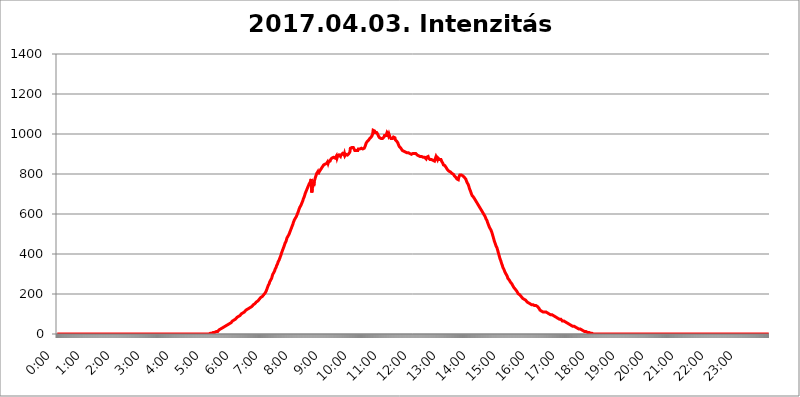
| Category | 2017.04.03. Intenzitás [W/m^2] |
|---|---|
| 0.0 | 0 |
| 0.0006944444444444445 | 0 |
| 0.001388888888888889 | 0 |
| 0.0020833333333333333 | 0 |
| 0.002777777777777778 | 0 |
| 0.003472222222222222 | 0 |
| 0.004166666666666667 | 0 |
| 0.004861111111111111 | 0 |
| 0.005555555555555556 | 0 |
| 0.0062499999999999995 | 0 |
| 0.006944444444444444 | 0 |
| 0.007638888888888889 | 0 |
| 0.008333333333333333 | 0 |
| 0.009027777777777779 | 0 |
| 0.009722222222222222 | 0 |
| 0.010416666666666666 | 0 |
| 0.011111111111111112 | 0 |
| 0.011805555555555555 | 0 |
| 0.012499999999999999 | 0 |
| 0.013194444444444444 | 0 |
| 0.013888888888888888 | 0 |
| 0.014583333333333332 | 0 |
| 0.015277777777777777 | 0 |
| 0.015972222222222224 | 0 |
| 0.016666666666666666 | 0 |
| 0.017361111111111112 | 0 |
| 0.018055555555555557 | 0 |
| 0.01875 | 0 |
| 0.019444444444444445 | 0 |
| 0.02013888888888889 | 0 |
| 0.020833333333333332 | 0 |
| 0.02152777777777778 | 0 |
| 0.022222222222222223 | 0 |
| 0.02291666666666667 | 0 |
| 0.02361111111111111 | 0 |
| 0.024305555555555556 | 0 |
| 0.024999999999999998 | 0 |
| 0.025694444444444447 | 0 |
| 0.02638888888888889 | 0 |
| 0.027083333333333334 | 0 |
| 0.027777777777777776 | 0 |
| 0.02847222222222222 | 0 |
| 0.029166666666666664 | 0 |
| 0.029861111111111113 | 0 |
| 0.030555555555555555 | 0 |
| 0.03125 | 0 |
| 0.03194444444444445 | 0 |
| 0.03263888888888889 | 0 |
| 0.03333333333333333 | 0 |
| 0.034027777777777775 | 0 |
| 0.034722222222222224 | 0 |
| 0.035416666666666666 | 0 |
| 0.036111111111111115 | 0 |
| 0.03680555555555556 | 0 |
| 0.0375 | 0 |
| 0.03819444444444444 | 0 |
| 0.03888888888888889 | 0 |
| 0.03958333333333333 | 0 |
| 0.04027777777777778 | 0 |
| 0.04097222222222222 | 0 |
| 0.041666666666666664 | 0 |
| 0.042361111111111106 | 0 |
| 0.04305555555555556 | 0 |
| 0.043750000000000004 | 0 |
| 0.044444444444444446 | 0 |
| 0.04513888888888889 | 0 |
| 0.04583333333333334 | 0 |
| 0.04652777777777778 | 0 |
| 0.04722222222222222 | 0 |
| 0.04791666666666666 | 0 |
| 0.04861111111111111 | 0 |
| 0.049305555555555554 | 0 |
| 0.049999999999999996 | 0 |
| 0.05069444444444445 | 0 |
| 0.051388888888888894 | 0 |
| 0.052083333333333336 | 0 |
| 0.05277777777777778 | 0 |
| 0.05347222222222222 | 0 |
| 0.05416666666666667 | 0 |
| 0.05486111111111111 | 0 |
| 0.05555555555555555 | 0 |
| 0.05625 | 0 |
| 0.05694444444444444 | 0 |
| 0.057638888888888885 | 0 |
| 0.05833333333333333 | 0 |
| 0.05902777777777778 | 0 |
| 0.059722222222222225 | 0 |
| 0.06041666666666667 | 0 |
| 0.061111111111111116 | 0 |
| 0.06180555555555556 | 0 |
| 0.0625 | 0 |
| 0.06319444444444444 | 0 |
| 0.06388888888888888 | 0 |
| 0.06458333333333334 | 0 |
| 0.06527777777777778 | 0 |
| 0.06597222222222222 | 0 |
| 0.06666666666666667 | 0 |
| 0.06736111111111111 | 0 |
| 0.06805555555555555 | 0 |
| 0.06874999999999999 | 0 |
| 0.06944444444444443 | 0 |
| 0.07013888888888889 | 0 |
| 0.07083333333333333 | 0 |
| 0.07152777777777779 | 0 |
| 0.07222222222222223 | 0 |
| 0.07291666666666667 | 0 |
| 0.07361111111111111 | 0 |
| 0.07430555555555556 | 0 |
| 0.075 | 0 |
| 0.07569444444444444 | 0 |
| 0.0763888888888889 | 0 |
| 0.07708333333333334 | 0 |
| 0.07777777777777778 | 0 |
| 0.07847222222222222 | 0 |
| 0.07916666666666666 | 0 |
| 0.0798611111111111 | 0 |
| 0.08055555555555556 | 0 |
| 0.08125 | 0 |
| 0.08194444444444444 | 0 |
| 0.08263888888888889 | 0 |
| 0.08333333333333333 | 0 |
| 0.08402777777777777 | 0 |
| 0.08472222222222221 | 0 |
| 0.08541666666666665 | 0 |
| 0.08611111111111112 | 0 |
| 0.08680555555555557 | 0 |
| 0.08750000000000001 | 0 |
| 0.08819444444444445 | 0 |
| 0.08888888888888889 | 0 |
| 0.08958333333333333 | 0 |
| 0.09027777777777778 | 0 |
| 0.09097222222222222 | 0 |
| 0.09166666666666667 | 0 |
| 0.09236111111111112 | 0 |
| 0.09305555555555556 | 0 |
| 0.09375 | 0 |
| 0.09444444444444444 | 0 |
| 0.09513888888888888 | 0 |
| 0.09583333333333333 | 0 |
| 0.09652777777777777 | 0 |
| 0.09722222222222222 | 0 |
| 0.09791666666666667 | 0 |
| 0.09861111111111111 | 0 |
| 0.09930555555555555 | 0 |
| 0.09999999999999999 | 0 |
| 0.10069444444444443 | 0 |
| 0.1013888888888889 | 0 |
| 0.10208333333333335 | 0 |
| 0.10277777777777779 | 0 |
| 0.10347222222222223 | 0 |
| 0.10416666666666667 | 0 |
| 0.10486111111111111 | 0 |
| 0.10555555555555556 | 0 |
| 0.10625 | 0 |
| 0.10694444444444444 | 0 |
| 0.1076388888888889 | 0 |
| 0.10833333333333334 | 0 |
| 0.10902777777777778 | 0 |
| 0.10972222222222222 | 0 |
| 0.1111111111111111 | 0 |
| 0.11180555555555556 | 0 |
| 0.11180555555555556 | 0 |
| 0.1125 | 0 |
| 0.11319444444444444 | 0 |
| 0.11388888888888889 | 0 |
| 0.11458333333333333 | 0 |
| 0.11527777777777777 | 0 |
| 0.11597222222222221 | 0 |
| 0.11666666666666665 | 0 |
| 0.1173611111111111 | 0 |
| 0.11805555555555557 | 0 |
| 0.11944444444444445 | 0 |
| 0.12013888888888889 | 0 |
| 0.12083333333333333 | 0 |
| 0.12152777777777778 | 0 |
| 0.12222222222222223 | 0 |
| 0.12291666666666667 | 0 |
| 0.12291666666666667 | 0 |
| 0.12361111111111112 | 0 |
| 0.12430555555555556 | 0 |
| 0.125 | 0 |
| 0.12569444444444444 | 0 |
| 0.12638888888888888 | 0 |
| 0.12708333333333333 | 0 |
| 0.16875 | 0 |
| 0.12847222222222224 | 0 |
| 0.12916666666666668 | 0 |
| 0.12986111111111112 | 0 |
| 0.13055555555555556 | 0 |
| 0.13125 | 0 |
| 0.13194444444444445 | 0 |
| 0.1326388888888889 | 0 |
| 0.13333333333333333 | 0 |
| 0.13402777777777777 | 0 |
| 0.13402777777777777 | 0 |
| 0.13472222222222222 | 0 |
| 0.13541666666666666 | 0 |
| 0.1361111111111111 | 0 |
| 0.13749999999999998 | 0 |
| 0.13819444444444443 | 0 |
| 0.1388888888888889 | 0 |
| 0.13958333333333334 | 0 |
| 0.14027777777777778 | 0 |
| 0.14097222222222222 | 0 |
| 0.14166666666666666 | 0 |
| 0.1423611111111111 | 0 |
| 0.14305555555555557 | 0 |
| 0.14375000000000002 | 0 |
| 0.14444444444444446 | 0 |
| 0.1451388888888889 | 0 |
| 0.1451388888888889 | 0 |
| 0.14652777777777778 | 0 |
| 0.14722222222222223 | 0 |
| 0.14791666666666667 | 0 |
| 0.1486111111111111 | 0 |
| 0.14930555555555555 | 0 |
| 0.15 | 0 |
| 0.15069444444444444 | 0 |
| 0.15138888888888888 | 0 |
| 0.15208333333333332 | 0 |
| 0.15277777777777776 | 0 |
| 0.15347222222222223 | 0 |
| 0.15416666666666667 | 0 |
| 0.15486111111111112 | 0 |
| 0.15555555555555556 | 0 |
| 0.15625 | 0 |
| 0.15694444444444444 | 0 |
| 0.15763888888888888 | 0 |
| 0.15833333333333333 | 0 |
| 0.15902777777777777 | 0 |
| 0.15972222222222224 | 0 |
| 0.16041666666666668 | 0 |
| 0.16111111111111112 | 0 |
| 0.16180555555555556 | 0 |
| 0.1625 | 0 |
| 0.16319444444444445 | 0 |
| 0.1638888888888889 | 0 |
| 0.16458333333333333 | 0 |
| 0.16527777777777777 | 0 |
| 0.16597222222222222 | 0 |
| 0.16666666666666666 | 0 |
| 0.1673611111111111 | 0 |
| 0.16805555555555554 | 0 |
| 0.16874999999999998 | 0 |
| 0.16944444444444443 | 0 |
| 0.17013888888888887 | 0 |
| 0.1708333333333333 | 0 |
| 0.17152777777777775 | 0 |
| 0.17222222222222225 | 0 |
| 0.1729166666666667 | 0 |
| 0.17361111111111113 | 0 |
| 0.17430555555555557 | 0 |
| 0.17500000000000002 | 0 |
| 0.17569444444444446 | 0 |
| 0.1763888888888889 | 0 |
| 0.17708333333333334 | 0 |
| 0.17777777777777778 | 0 |
| 0.17847222222222223 | 0 |
| 0.17916666666666667 | 0 |
| 0.1798611111111111 | 0 |
| 0.18055555555555555 | 0 |
| 0.18125 | 0 |
| 0.18194444444444444 | 0 |
| 0.1826388888888889 | 0 |
| 0.18333333333333335 | 0 |
| 0.1840277777777778 | 0 |
| 0.18472222222222223 | 0 |
| 0.18541666666666667 | 0 |
| 0.18611111111111112 | 0 |
| 0.18680555555555556 | 0 |
| 0.1875 | 0 |
| 0.18819444444444444 | 0 |
| 0.18888888888888888 | 0 |
| 0.18958333333333333 | 0 |
| 0.19027777777777777 | 0 |
| 0.1909722222222222 | 0 |
| 0.19166666666666665 | 0 |
| 0.19236111111111112 | 0 |
| 0.19305555555555554 | 0 |
| 0.19375 | 0 |
| 0.19444444444444445 | 0 |
| 0.1951388888888889 | 0 |
| 0.19583333333333333 | 0 |
| 0.19652777777777777 | 0 |
| 0.19722222222222222 | 0 |
| 0.19791666666666666 | 0 |
| 0.1986111111111111 | 0 |
| 0.19930555555555554 | 0 |
| 0.19999999999999998 | 0 |
| 0.20069444444444443 | 0 |
| 0.20138888888888887 | 0 |
| 0.2020833333333333 | 0 |
| 0.2027777777777778 | 0 |
| 0.2034722222222222 | 0 |
| 0.2041666666666667 | 0 |
| 0.20486111111111113 | 0 |
| 0.20555555555555557 | 0 |
| 0.20625000000000002 | 0 |
| 0.20694444444444446 | 0 |
| 0.2076388888888889 | 0 |
| 0.20833333333333334 | 0 |
| 0.20902777777777778 | 0 |
| 0.20972222222222223 | 0 |
| 0.21041666666666667 | 0 |
| 0.2111111111111111 | 0 |
| 0.21180555555555555 | 0 |
| 0.2125 | 0 |
| 0.21319444444444444 | 3.525 |
| 0.2138888888888889 | 3.525 |
| 0.21458333333333335 | 3.525 |
| 0.2152777777777778 | 3.525 |
| 0.21597222222222223 | 3.525 |
| 0.21666666666666667 | 3.525 |
| 0.21736111111111112 | 3.525 |
| 0.21805555555555556 | 3.525 |
| 0.21875 | 7.887 |
| 0.21944444444444444 | 7.887 |
| 0.22013888888888888 | 7.887 |
| 0.22083333333333333 | 7.887 |
| 0.22152777777777777 | 7.887 |
| 0.2222222222222222 | 7.887 |
| 0.22291666666666665 | 12.257 |
| 0.2236111111111111 | 12.257 |
| 0.22430555555555556 | 12.257 |
| 0.225 | 12.257 |
| 0.22569444444444445 | 16.636 |
| 0.2263888888888889 | 16.636 |
| 0.22708333333333333 | 21.024 |
| 0.22777777777777777 | 21.024 |
| 0.22847222222222222 | 21.024 |
| 0.22916666666666666 | 25.419 |
| 0.2298611111111111 | 25.419 |
| 0.23055555555555554 | 25.419 |
| 0.23124999999999998 | 29.823 |
| 0.23194444444444443 | 29.823 |
| 0.23263888888888887 | 29.823 |
| 0.2333333333333333 | 34.234 |
| 0.2340277777777778 | 34.234 |
| 0.2347222222222222 | 38.653 |
| 0.2354166666666667 | 38.653 |
| 0.23611111111111113 | 38.653 |
| 0.23680555555555557 | 38.653 |
| 0.23750000000000002 | 43.079 |
| 0.23819444444444446 | 43.079 |
| 0.2388888888888889 | 47.511 |
| 0.23958333333333334 | 47.511 |
| 0.24027777777777778 | 47.511 |
| 0.24097222222222223 | 51.951 |
| 0.24166666666666667 | 51.951 |
| 0.2423611111111111 | 56.398 |
| 0.24305555555555555 | 56.398 |
| 0.24375 | 56.398 |
| 0.24444444444444446 | 60.85 |
| 0.24513888888888888 | 60.85 |
| 0.24583333333333335 | 65.31 |
| 0.2465277777777778 | 65.31 |
| 0.24722222222222223 | 65.31 |
| 0.24791666666666667 | 69.775 |
| 0.24861111111111112 | 74.246 |
| 0.24930555555555556 | 74.246 |
| 0.25 | 74.246 |
| 0.25069444444444444 | 78.722 |
| 0.2513888888888889 | 78.722 |
| 0.2520833333333333 | 83.205 |
| 0.25277777777777777 | 83.205 |
| 0.2534722222222222 | 83.205 |
| 0.25416666666666665 | 87.692 |
| 0.2548611111111111 | 87.692 |
| 0.2555555555555556 | 92.184 |
| 0.25625000000000003 | 92.184 |
| 0.2569444444444445 | 96.682 |
| 0.2576388888888889 | 96.682 |
| 0.25833333333333336 | 101.184 |
| 0.2590277777777778 | 101.184 |
| 0.25972222222222224 | 101.184 |
| 0.2604166666666667 | 105.69 |
| 0.2611111111111111 | 110.201 |
| 0.26180555555555557 | 110.201 |
| 0.2625 | 110.201 |
| 0.26319444444444445 | 114.716 |
| 0.2638888888888889 | 114.716 |
| 0.26458333333333334 | 119.235 |
| 0.2652777777777778 | 119.235 |
| 0.2659722222222222 | 119.235 |
| 0.26666666666666666 | 123.758 |
| 0.2673611111111111 | 128.284 |
| 0.26805555555555555 | 128.284 |
| 0.26875 | 128.284 |
| 0.26944444444444443 | 132.814 |
| 0.2701388888888889 | 132.814 |
| 0.2708333333333333 | 132.814 |
| 0.27152777777777776 | 137.347 |
| 0.2722222222222222 | 137.347 |
| 0.27291666666666664 | 137.347 |
| 0.2736111111111111 | 141.884 |
| 0.2743055555555555 | 141.884 |
| 0.27499999999999997 | 146.423 |
| 0.27569444444444446 | 146.423 |
| 0.27638888888888885 | 150.964 |
| 0.27708333333333335 | 150.964 |
| 0.2777777777777778 | 155.509 |
| 0.27847222222222223 | 155.509 |
| 0.2791666666666667 | 160.056 |
| 0.2798611111111111 | 164.605 |
| 0.28055555555555556 | 164.605 |
| 0.28125 | 164.605 |
| 0.28194444444444444 | 169.156 |
| 0.2826388888888889 | 169.156 |
| 0.2833333333333333 | 173.709 |
| 0.28402777777777777 | 178.264 |
| 0.2847222222222222 | 178.264 |
| 0.28541666666666665 | 182.82 |
| 0.28611111111111115 | 182.82 |
| 0.28680555555555554 | 182.82 |
| 0.28750000000000003 | 187.378 |
| 0.2881944444444445 | 187.378 |
| 0.2888888888888889 | 191.937 |
| 0.28958333333333336 | 196.497 |
| 0.2902777777777778 | 196.497 |
| 0.29097222222222224 | 201.058 |
| 0.2916666666666667 | 205.62 |
| 0.2923611111111111 | 210.182 |
| 0.29305555555555557 | 214.746 |
| 0.29375 | 219.309 |
| 0.29444444444444445 | 228.436 |
| 0.2951388888888889 | 233 |
| 0.29583333333333334 | 242.127 |
| 0.2965277777777778 | 246.689 |
| 0.2972222222222222 | 251.251 |
| 0.29791666666666666 | 260.373 |
| 0.2986111111111111 | 264.932 |
| 0.29930555555555555 | 269.49 |
| 0.3 | 274.047 |
| 0.30069444444444443 | 278.603 |
| 0.3013888888888889 | 287.709 |
| 0.3020833333333333 | 296.808 |
| 0.30277777777777776 | 301.354 |
| 0.3034722222222222 | 305.898 |
| 0.30416666666666664 | 310.44 |
| 0.3048611111111111 | 314.98 |
| 0.3055555555555555 | 324.052 |
| 0.30624999999999997 | 328.584 |
| 0.3069444444444444 | 333.113 |
| 0.3076388888888889 | 342.162 |
| 0.30833333333333335 | 346.682 |
| 0.3090277777777778 | 351.198 |
| 0.30972222222222223 | 360.221 |
| 0.3104166666666667 | 364.728 |
| 0.3111111111111111 | 369.23 |
| 0.31180555555555556 | 373.729 |
| 0.3125 | 382.715 |
| 0.31319444444444444 | 387.202 |
| 0.3138888888888889 | 396.164 |
| 0.3145833333333333 | 405.108 |
| 0.31527777777777777 | 409.574 |
| 0.3159722222222222 | 418.492 |
| 0.31666666666666665 | 422.943 |
| 0.31736111111111115 | 431.833 |
| 0.31805555555555554 | 436.27 |
| 0.31875000000000003 | 445.129 |
| 0.3194444444444445 | 453.968 |
| 0.3201388888888889 | 458.38 |
| 0.32083333333333336 | 462.786 |
| 0.3215277777777778 | 471.582 |
| 0.32222222222222224 | 480.356 |
| 0.3229166666666667 | 484.735 |
| 0.3236111111111111 | 489.108 |
| 0.32430555555555557 | 493.475 |
| 0.325 | 497.836 |
| 0.32569444444444445 | 502.192 |
| 0.3263888888888889 | 510.885 |
| 0.32708333333333334 | 515.223 |
| 0.3277777777777778 | 523.88 |
| 0.3284722222222222 | 528.2 |
| 0.32916666666666666 | 536.82 |
| 0.3298611111111111 | 541.121 |
| 0.33055555555555555 | 549.704 |
| 0.33125 | 558.261 |
| 0.33194444444444443 | 562.53 |
| 0.3326388888888889 | 571.049 |
| 0.3333333333333333 | 575.299 |
| 0.3340277777777778 | 579.542 |
| 0.3347222222222222 | 583.779 |
| 0.3354166666666667 | 588.009 |
| 0.3361111111111111 | 592.233 |
| 0.3368055555555556 | 600.661 |
| 0.33749999999999997 | 604.864 |
| 0.33819444444444446 | 613.252 |
| 0.33888888888888885 | 621.613 |
| 0.33958333333333335 | 625.784 |
| 0.34027777777777773 | 634.105 |
| 0.34097222222222223 | 638.256 |
| 0.3416666666666666 | 642.4 |
| 0.3423611111111111 | 646.537 |
| 0.3430555555555555 | 654.791 |
| 0.34375 | 658.909 |
| 0.3444444444444445 | 667.123 |
| 0.3451388888888889 | 675.311 |
| 0.3458333333333334 | 679.395 |
| 0.34652777777777777 | 687.544 |
| 0.34722222222222227 | 695.666 |
| 0.34791666666666665 | 703.762 |
| 0.34861111111111115 | 707.8 |
| 0.34930555555555554 | 715.858 |
| 0.35000000000000003 | 719.877 |
| 0.3506944444444444 | 727.896 |
| 0.3513888888888889 | 731.896 |
| 0.3520833333333333 | 739.877 |
| 0.3527777777777778 | 743.859 |
| 0.3534722222222222 | 751.803 |
| 0.3541666666666667 | 751.803 |
| 0.3548611111111111 | 759.723 |
| 0.35555555555555557 | 767.62 |
| 0.35625 | 775.492 |
| 0.35694444444444445 | 707.8 |
| 0.3576388888888889 | 727.896 |
| 0.35833333333333334 | 735.89 |
| 0.3590277777777778 | 747.834 |
| 0.3597222222222222 | 739.877 |
| 0.36041666666666666 | 759.723 |
| 0.3611111111111111 | 771.559 |
| 0.36180555555555555 | 775.492 |
| 0.3625 | 787.258 |
| 0.36319444444444443 | 787.258 |
| 0.3638888888888889 | 802.868 |
| 0.3645833333333333 | 802.868 |
| 0.3652777777777778 | 810.641 |
| 0.3659722222222222 | 798.974 |
| 0.3666666666666667 | 806.757 |
| 0.3673611111111111 | 810.641 |
| 0.3680555555555556 | 810.641 |
| 0.36874999999999997 | 818.392 |
| 0.36944444444444446 | 822.26 |
| 0.37013888888888885 | 826.123 |
| 0.37083333333333335 | 829.981 |
| 0.37152777777777773 | 833.834 |
| 0.37222222222222223 | 833.834 |
| 0.3729166666666666 | 837.682 |
| 0.3736111111111111 | 845.365 |
| 0.3743055555555555 | 845.365 |
| 0.375 | 845.365 |
| 0.3756944444444445 | 849.199 |
| 0.3763888888888889 | 849.199 |
| 0.3770833333333334 | 853.029 |
| 0.37777777777777777 | 853.029 |
| 0.37847222222222227 | 853.029 |
| 0.37916666666666665 | 860.676 |
| 0.37986111111111115 | 853.029 |
| 0.38055555555555554 | 860.676 |
| 0.38125000000000003 | 856.855 |
| 0.3819444444444444 | 864.493 |
| 0.3826388888888889 | 864.493 |
| 0.3833333333333333 | 872.114 |
| 0.3840277777777778 | 868.305 |
| 0.3847222222222222 | 868.305 |
| 0.3854166666666667 | 879.719 |
| 0.3861111111111111 | 883.516 |
| 0.38680555555555557 | 879.719 |
| 0.3875 | 883.516 |
| 0.38819444444444445 | 879.719 |
| 0.3888888888888889 | 883.516 |
| 0.38958333333333334 | 879.719 |
| 0.3902777777777778 | 883.516 |
| 0.3909722222222222 | 883.516 |
| 0.39166666666666666 | 891.099 |
| 0.3923611111111111 | 879.719 |
| 0.39305555555555555 | 887.309 |
| 0.39375 | 891.099 |
| 0.39444444444444443 | 891.099 |
| 0.3951388888888889 | 894.885 |
| 0.3958333333333333 | 891.099 |
| 0.3965277777777778 | 891.099 |
| 0.3972222222222222 | 887.309 |
| 0.3979166666666667 | 894.885 |
| 0.3986111111111111 | 894.885 |
| 0.3993055555555556 | 894.885 |
| 0.39999999999999997 | 902.447 |
| 0.40069444444444446 | 898.668 |
| 0.40138888888888885 | 898.668 |
| 0.40208333333333335 | 894.885 |
| 0.40277777777777773 | 902.447 |
| 0.40347222222222223 | 891.099 |
| 0.4041666666666666 | 891.099 |
| 0.4048611111111111 | 898.668 |
| 0.4055555555555555 | 898.668 |
| 0.40625 | 898.668 |
| 0.4069444444444445 | 894.885 |
| 0.4076388888888889 | 898.668 |
| 0.4083333333333334 | 898.668 |
| 0.40902777777777777 | 902.447 |
| 0.40972222222222227 | 902.447 |
| 0.41041666666666665 | 909.996 |
| 0.41111111111111115 | 928.819 |
| 0.41180555555555554 | 925.06 |
| 0.41250000000000003 | 928.819 |
| 0.4131944444444444 | 932.576 |
| 0.4138888888888889 | 932.576 |
| 0.4145833333333333 | 936.33 |
| 0.4152777777777778 | 932.576 |
| 0.4159722222222222 | 932.576 |
| 0.4166666666666667 | 932.576 |
| 0.4173611111111111 | 917.534 |
| 0.41805555555555557 | 917.534 |
| 0.41875 | 921.298 |
| 0.41944444444444445 | 917.534 |
| 0.4201388888888889 | 921.298 |
| 0.42083333333333334 | 921.298 |
| 0.4215277777777778 | 917.534 |
| 0.4222222222222222 | 925.06 |
| 0.42291666666666666 | 925.06 |
| 0.4236111111111111 | 925.06 |
| 0.42430555555555555 | 925.06 |
| 0.425 | 925.06 |
| 0.42569444444444443 | 925.06 |
| 0.4263888888888889 | 928.819 |
| 0.4270833333333333 | 925.06 |
| 0.4277777777777778 | 928.819 |
| 0.4284722222222222 | 925.06 |
| 0.4291666666666667 | 928.819 |
| 0.4298611111111111 | 928.819 |
| 0.4305555555555556 | 928.819 |
| 0.43124999999999997 | 932.576 |
| 0.43194444444444446 | 940.082 |
| 0.43263888888888885 | 947.58 |
| 0.43333333333333335 | 955.071 |
| 0.43402777777777773 | 958.814 |
| 0.43472222222222223 | 962.555 |
| 0.4354166666666666 | 966.295 |
| 0.4361111111111111 | 966.295 |
| 0.4368055555555555 | 970.034 |
| 0.4375 | 973.772 |
| 0.4381944444444445 | 977.508 |
| 0.4388888888888889 | 977.508 |
| 0.4395833333333334 | 981.244 |
| 0.44027777777777777 | 984.98 |
| 0.44097222222222227 | 984.98 |
| 0.44166666666666665 | 992.448 |
| 0.44236111111111115 | 999.916 |
| 0.44305555555555554 | 1018.587 |
| 0.44375000000000003 | 1018.587 |
| 0.4444444444444444 | 1022.323 |
| 0.4451388888888889 | 1014.852 |
| 0.4458333333333333 | 1007.383 |
| 0.4465277777777778 | 1007.383 |
| 0.4472222222222222 | 1007.383 |
| 0.4479166666666667 | 1007.383 |
| 0.4486111111111111 | 1003.65 |
| 0.44930555555555557 | 999.916 |
| 0.45 | 996.182 |
| 0.45069444444444445 | 988.714 |
| 0.4513888888888889 | 988.714 |
| 0.45208333333333334 | 981.244 |
| 0.4527777777777778 | 984.98 |
| 0.4534722222222222 | 984.98 |
| 0.45416666666666666 | 977.508 |
| 0.4548611111111111 | 977.508 |
| 0.45555555555555555 | 981.244 |
| 0.45625 | 977.508 |
| 0.45694444444444443 | 977.508 |
| 0.4576388888888889 | 977.508 |
| 0.4583333333333333 | 984.98 |
| 0.4590277777777778 | 992.448 |
| 0.4597222222222222 | 996.182 |
| 0.4604166666666667 | 992.448 |
| 0.4611111111111111 | 992.448 |
| 0.4618055555555556 | 996.182 |
| 0.46249999999999997 | 1007.383 |
| 0.46319444444444446 | 1011.118 |
| 0.46388888888888885 | 999.916 |
| 0.46458333333333335 | 992.448 |
| 0.46527777777777773 | 999.916 |
| 0.46597222222222223 | 992.448 |
| 0.4666666666666666 | 984.98 |
| 0.4673611111111111 | 981.244 |
| 0.4680555555555555 | 977.508 |
| 0.46875 | 981.244 |
| 0.4694444444444445 | 977.508 |
| 0.4701388888888889 | 977.508 |
| 0.4708333333333334 | 981.244 |
| 0.47152777777777777 | 984.98 |
| 0.47222222222222227 | 981.244 |
| 0.47291666666666665 | 981.244 |
| 0.47361111111111115 | 981.244 |
| 0.47430555555555554 | 970.034 |
| 0.47500000000000003 | 973.772 |
| 0.4756944444444444 | 973.772 |
| 0.4763888888888889 | 962.555 |
| 0.4770833333333333 | 958.814 |
| 0.4777777777777778 | 955.071 |
| 0.4784722222222222 | 947.58 |
| 0.4791666666666667 | 943.832 |
| 0.4798611111111111 | 936.33 |
| 0.48055555555555557 | 936.33 |
| 0.48125 | 932.576 |
| 0.48194444444444445 | 928.819 |
| 0.4826388888888889 | 925.06 |
| 0.48333333333333334 | 925.06 |
| 0.4840277777777778 | 917.534 |
| 0.4847222222222222 | 917.534 |
| 0.48541666666666666 | 917.534 |
| 0.4861111111111111 | 913.766 |
| 0.48680555555555555 | 913.766 |
| 0.4875 | 909.996 |
| 0.48819444444444443 | 909.996 |
| 0.4888888888888889 | 906.223 |
| 0.4895833333333333 | 906.223 |
| 0.4902777777777778 | 906.223 |
| 0.4909722222222222 | 906.223 |
| 0.4916666666666667 | 906.223 |
| 0.4923611111111111 | 906.223 |
| 0.4930555555555556 | 906.223 |
| 0.49374999999999997 | 906.223 |
| 0.49444444444444446 | 902.447 |
| 0.49513888888888885 | 902.447 |
| 0.49583333333333335 | 902.447 |
| 0.49652777777777773 | 898.668 |
| 0.49722222222222223 | 898.668 |
| 0.4979166666666666 | 902.447 |
| 0.4986111111111111 | 902.447 |
| 0.4993055555555555 | 902.447 |
| 0.5 | 898.668 |
| 0.5006944444444444 | 902.447 |
| 0.5013888888888889 | 902.447 |
| 0.5020833333333333 | 902.447 |
| 0.5027777777777778 | 902.447 |
| 0.5034722222222222 | 898.668 |
| 0.5041666666666667 | 898.668 |
| 0.5048611111111111 | 894.885 |
| 0.5055555555555555 | 898.668 |
| 0.50625 | 894.885 |
| 0.5069444444444444 | 891.099 |
| 0.5076388888888889 | 891.099 |
| 0.5083333333333333 | 887.309 |
| 0.5090277777777777 | 887.309 |
| 0.5097222222222222 | 887.309 |
| 0.5104166666666666 | 887.309 |
| 0.5111111111111112 | 887.309 |
| 0.5118055555555555 | 887.309 |
| 0.5125000000000001 | 887.309 |
| 0.5131944444444444 | 883.516 |
| 0.513888888888889 | 883.516 |
| 0.5145833333333333 | 879.719 |
| 0.5152777777777778 | 883.516 |
| 0.5159722222222222 | 883.516 |
| 0.5166666666666667 | 879.719 |
| 0.517361111111111 | 875.918 |
| 0.5180555555555556 | 883.516 |
| 0.5187499999999999 | 883.516 |
| 0.5194444444444445 | 883.516 |
| 0.5201388888888888 | 887.309 |
| 0.5208333333333334 | 879.719 |
| 0.5215277777777778 | 879.719 |
| 0.5222222222222223 | 875.918 |
| 0.5229166666666667 | 872.114 |
| 0.5236111111111111 | 875.918 |
| 0.5243055555555556 | 868.305 |
| 0.525 | 872.114 |
| 0.5256944444444445 | 872.114 |
| 0.5263888888888889 | 868.305 |
| 0.5270833333333333 | 868.305 |
| 0.5277777777777778 | 864.493 |
| 0.5284722222222222 | 864.493 |
| 0.5291666666666667 | 864.493 |
| 0.5298611111111111 | 872.114 |
| 0.5305555555555556 | 879.719 |
| 0.53125 | 887.309 |
| 0.5319444444444444 | 891.099 |
| 0.5326388888888889 | 887.309 |
| 0.5333333333333333 | 872.114 |
| 0.5340277777777778 | 879.719 |
| 0.5347222222222222 | 875.918 |
| 0.5354166666666667 | 875.918 |
| 0.5361111111111111 | 872.114 |
| 0.5368055555555555 | 872.114 |
| 0.5375 | 872.114 |
| 0.5381944444444444 | 872.114 |
| 0.5388888888888889 | 868.305 |
| 0.5395833333333333 | 860.676 |
| 0.5402777777777777 | 856.855 |
| 0.5409722222222222 | 853.029 |
| 0.5416666666666666 | 845.365 |
| 0.5423611111111112 | 845.365 |
| 0.5430555555555555 | 841.526 |
| 0.5437500000000001 | 841.526 |
| 0.5444444444444444 | 837.682 |
| 0.545138888888889 | 833.834 |
| 0.5458333333333333 | 829.981 |
| 0.5465277777777778 | 829.981 |
| 0.5472222222222222 | 822.26 |
| 0.5479166666666667 | 822.26 |
| 0.548611111111111 | 818.392 |
| 0.5493055555555556 | 814.519 |
| 0.5499999999999999 | 814.519 |
| 0.5506944444444445 | 810.641 |
| 0.5513888888888888 | 810.641 |
| 0.5520833333333334 | 806.757 |
| 0.5527777777777778 | 806.757 |
| 0.5534722222222223 | 802.868 |
| 0.5541666666666667 | 798.974 |
| 0.5548611111111111 | 798.974 |
| 0.5555555555555556 | 798.974 |
| 0.55625 | 798.974 |
| 0.5569444444444445 | 791.169 |
| 0.5576388888888889 | 791.169 |
| 0.5583333333333333 | 787.258 |
| 0.5590277777777778 | 783.342 |
| 0.5597222222222222 | 779.42 |
| 0.5604166666666667 | 775.492 |
| 0.5611111111111111 | 771.559 |
| 0.5618055555555556 | 775.492 |
| 0.5625 | 771.559 |
| 0.5631944444444444 | 783.342 |
| 0.5638888888888889 | 787.258 |
| 0.5645833333333333 | 795.074 |
| 0.5652777777777778 | 795.074 |
| 0.5659722222222222 | 795.074 |
| 0.5666666666666667 | 795.074 |
| 0.5673611111111111 | 795.074 |
| 0.5680555555555555 | 798.974 |
| 0.56875 | 791.169 |
| 0.5694444444444444 | 791.169 |
| 0.5701388888888889 | 791.169 |
| 0.5708333333333333 | 783.342 |
| 0.5715277777777777 | 783.342 |
| 0.5722222222222222 | 783.342 |
| 0.5729166666666666 | 775.492 |
| 0.5736111111111112 | 767.62 |
| 0.5743055555555555 | 763.674 |
| 0.5750000000000001 | 755.766 |
| 0.5756944444444444 | 751.803 |
| 0.576388888888889 | 747.834 |
| 0.5770833333333333 | 739.877 |
| 0.5777777777777778 | 731.896 |
| 0.5784722222222222 | 723.889 |
| 0.5791666666666667 | 719.877 |
| 0.579861111111111 | 711.832 |
| 0.5805555555555556 | 703.762 |
| 0.5812499999999999 | 699.717 |
| 0.5819444444444445 | 691.608 |
| 0.5826388888888888 | 691.608 |
| 0.5833333333333334 | 687.544 |
| 0.5840277777777778 | 683.473 |
| 0.5847222222222223 | 679.395 |
| 0.5854166666666667 | 675.311 |
| 0.5861111111111111 | 675.311 |
| 0.5868055555555556 | 671.22 |
| 0.5875 | 663.019 |
| 0.5881944444444445 | 658.909 |
| 0.5888888888888889 | 654.791 |
| 0.5895833333333333 | 650.667 |
| 0.5902777777777778 | 650.667 |
| 0.5909722222222222 | 642.4 |
| 0.5916666666666667 | 642.4 |
| 0.5923611111111111 | 634.105 |
| 0.5930555555555556 | 629.948 |
| 0.59375 | 625.784 |
| 0.5944444444444444 | 625.784 |
| 0.5951388888888889 | 617.436 |
| 0.5958333333333333 | 617.436 |
| 0.5965277777777778 | 609.062 |
| 0.5972222222222222 | 604.864 |
| 0.5979166666666667 | 600.661 |
| 0.5986111111111111 | 596.45 |
| 0.5993055555555555 | 596.45 |
| 0.6 | 588.009 |
| 0.6006944444444444 | 583.779 |
| 0.6013888888888889 | 575.299 |
| 0.6020833333333333 | 571.049 |
| 0.6027777777777777 | 566.793 |
| 0.6034722222222222 | 558.261 |
| 0.6041666666666666 | 553.986 |
| 0.6048611111111112 | 545.416 |
| 0.6055555555555555 | 541.121 |
| 0.6062500000000001 | 532.513 |
| 0.6069444444444444 | 532.513 |
| 0.607638888888889 | 528.2 |
| 0.6083333333333333 | 519.555 |
| 0.6090277777777778 | 515.223 |
| 0.6097222222222222 | 506.542 |
| 0.6104166666666667 | 497.836 |
| 0.611111111111111 | 489.108 |
| 0.6118055555555556 | 480.356 |
| 0.6124999999999999 | 475.972 |
| 0.6131944444444445 | 462.786 |
| 0.6138888888888888 | 458.38 |
| 0.6145833333333334 | 449.551 |
| 0.6152777777777778 | 440.702 |
| 0.6159722222222223 | 436.27 |
| 0.6166666666666667 | 431.833 |
| 0.6173611111111111 | 422.943 |
| 0.6180555555555556 | 414.035 |
| 0.61875 | 405.108 |
| 0.6194444444444445 | 396.164 |
| 0.6201388888888889 | 387.202 |
| 0.6208333333333333 | 378.224 |
| 0.6215277777777778 | 373.729 |
| 0.6222222222222222 | 364.728 |
| 0.6229166666666667 | 355.712 |
| 0.6236111111111111 | 351.198 |
| 0.6243055555555556 | 342.162 |
| 0.625 | 333.113 |
| 0.6256944444444444 | 328.584 |
| 0.6263888888888889 | 324.052 |
| 0.6270833333333333 | 319.517 |
| 0.6277777777777778 | 310.44 |
| 0.6284722222222222 | 310.44 |
| 0.6291666666666667 | 305.898 |
| 0.6298611111111111 | 296.808 |
| 0.6305555555555555 | 292.259 |
| 0.63125 | 287.709 |
| 0.6319444444444444 | 278.603 |
| 0.6326388888888889 | 274.047 |
| 0.6333333333333333 | 274.047 |
| 0.6340277777777777 | 269.49 |
| 0.6347222222222222 | 264.932 |
| 0.6354166666666666 | 260.373 |
| 0.6361111111111112 | 260.373 |
| 0.6368055555555555 | 255.813 |
| 0.6375000000000001 | 251.251 |
| 0.6381944444444444 | 246.689 |
| 0.638888888888889 | 242.127 |
| 0.6395833333333333 | 237.564 |
| 0.6402777777777778 | 233 |
| 0.6409722222222222 | 228.436 |
| 0.6416666666666667 | 228.436 |
| 0.642361111111111 | 223.873 |
| 0.6430555555555556 | 223.873 |
| 0.6437499999999999 | 219.309 |
| 0.6444444444444445 | 214.746 |
| 0.6451388888888888 | 210.182 |
| 0.6458333333333334 | 210.182 |
| 0.6465277777777778 | 201.058 |
| 0.6472222222222223 | 201.058 |
| 0.6479166666666667 | 196.497 |
| 0.6486111111111111 | 196.497 |
| 0.6493055555555556 | 191.937 |
| 0.65 | 191.937 |
| 0.6506944444444445 | 187.378 |
| 0.6513888888888889 | 187.378 |
| 0.6520833333333333 | 182.82 |
| 0.6527777777777778 | 178.264 |
| 0.6534722222222222 | 173.709 |
| 0.6541666666666667 | 173.709 |
| 0.6548611111111111 | 173.709 |
| 0.6555555555555556 | 173.709 |
| 0.65625 | 169.156 |
| 0.6569444444444444 | 169.156 |
| 0.6576388888888889 | 164.605 |
| 0.6583333333333333 | 164.605 |
| 0.6590277777777778 | 160.056 |
| 0.6597222222222222 | 160.056 |
| 0.6604166666666667 | 160.056 |
| 0.6611111111111111 | 155.509 |
| 0.6618055555555555 | 155.509 |
| 0.6625 | 150.964 |
| 0.6631944444444444 | 150.964 |
| 0.6638888888888889 | 150.964 |
| 0.6645833333333333 | 146.423 |
| 0.6652777777777777 | 146.423 |
| 0.6659722222222222 | 146.423 |
| 0.6666666666666666 | 146.423 |
| 0.6673611111111111 | 146.423 |
| 0.6680555555555556 | 146.423 |
| 0.6687500000000001 | 141.884 |
| 0.6694444444444444 | 141.884 |
| 0.6701388888888888 | 141.884 |
| 0.6708333333333334 | 141.884 |
| 0.6715277777777778 | 141.884 |
| 0.6722222222222222 | 141.884 |
| 0.6729166666666666 | 137.347 |
| 0.6736111111111112 | 137.347 |
| 0.6743055555555556 | 132.814 |
| 0.6749999999999999 | 132.814 |
| 0.6756944444444444 | 128.284 |
| 0.6763888888888889 | 123.758 |
| 0.6770833333333334 | 119.235 |
| 0.6777777777777777 | 119.235 |
| 0.6784722222222223 | 114.716 |
| 0.6791666666666667 | 114.716 |
| 0.6798611111111111 | 110.201 |
| 0.6805555555555555 | 110.201 |
| 0.68125 | 110.201 |
| 0.6819444444444445 | 110.201 |
| 0.6826388888888889 | 110.201 |
| 0.6833333333333332 | 110.201 |
| 0.6840277777777778 | 110.201 |
| 0.6847222222222222 | 110.201 |
| 0.6854166666666667 | 110.201 |
| 0.686111111111111 | 105.69 |
| 0.6868055555555556 | 105.69 |
| 0.6875 | 105.69 |
| 0.6881944444444444 | 105.69 |
| 0.688888888888889 | 101.184 |
| 0.6895833333333333 | 101.184 |
| 0.6902777777777778 | 101.184 |
| 0.6909722222222222 | 101.184 |
| 0.6916666666666668 | 96.682 |
| 0.6923611111111111 | 96.682 |
| 0.6930555555555555 | 96.682 |
| 0.69375 | 96.682 |
| 0.6944444444444445 | 92.184 |
| 0.6951388888888889 | 92.184 |
| 0.6958333333333333 | 92.184 |
| 0.6965277777777777 | 92.184 |
| 0.6972222222222223 | 87.692 |
| 0.6979166666666666 | 87.692 |
| 0.6986111111111111 | 83.205 |
| 0.6993055555555556 | 83.205 |
| 0.7000000000000001 | 83.205 |
| 0.7006944444444444 | 83.205 |
| 0.7013888888888888 | 78.722 |
| 0.7020833333333334 | 78.722 |
| 0.7027777777777778 | 78.722 |
| 0.7034722222222222 | 78.722 |
| 0.7041666666666666 | 74.246 |
| 0.7048611111111112 | 74.246 |
| 0.7055555555555556 | 74.246 |
| 0.7062499999999999 | 74.246 |
| 0.7069444444444444 | 69.775 |
| 0.7076388888888889 | 69.775 |
| 0.7083333333333334 | 65.31 |
| 0.7090277777777777 | 65.31 |
| 0.7097222222222223 | 65.31 |
| 0.7104166666666667 | 65.31 |
| 0.7111111111111111 | 60.85 |
| 0.7118055555555555 | 60.85 |
| 0.7125 | 60.85 |
| 0.7131944444444445 | 56.398 |
| 0.7138888888888889 | 56.398 |
| 0.7145833333333332 | 56.398 |
| 0.7152777777777778 | 56.398 |
| 0.7159722222222222 | 51.951 |
| 0.7166666666666667 | 51.951 |
| 0.717361111111111 | 51.951 |
| 0.7180555555555556 | 47.511 |
| 0.71875 | 47.511 |
| 0.7194444444444444 | 47.511 |
| 0.720138888888889 | 47.511 |
| 0.7208333333333333 | 43.079 |
| 0.7215277777777778 | 43.079 |
| 0.7222222222222222 | 43.079 |
| 0.7229166666666668 | 38.653 |
| 0.7236111111111111 | 38.653 |
| 0.7243055555555555 | 38.653 |
| 0.725 | 38.653 |
| 0.7256944444444445 | 38.653 |
| 0.7263888888888889 | 34.234 |
| 0.7270833333333333 | 34.234 |
| 0.7277777777777777 | 29.823 |
| 0.7284722222222223 | 29.823 |
| 0.7291666666666666 | 29.823 |
| 0.7298611111111111 | 29.823 |
| 0.7305555555555556 | 29.823 |
| 0.7312500000000001 | 25.419 |
| 0.7319444444444444 | 25.419 |
| 0.7326388888888888 | 25.419 |
| 0.7333333333333334 | 25.419 |
| 0.7340277777777778 | 21.024 |
| 0.7347222222222222 | 21.024 |
| 0.7354166666666666 | 21.024 |
| 0.7361111111111112 | 21.024 |
| 0.7368055555555556 | 16.636 |
| 0.7374999999999999 | 16.636 |
| 0.7381944444444444 | 16.636 |
| 0.7388888888888889 | 16.636 |
| 0.7395833333333334 | 12.257 |
| 0.7402777777777777 | 12.257 |
| 0.7409722222222223 | 12.257 |
| 0.7416666666666667 | 12.257 |
| 0.7423611111111111 | 12.257 |
| 0.7430555555555555 | 12.257 |
| 0.74375 | 7.887 |
| 0.7444444444444445 | 7.887 |
| 0.7451388888888889 | 7.887 |
| 0.7458333333333332 | 7.887 |
| 0.7465277777777778 | 7.887 |
| 0.7472222222222222 | 3.525 |
| 0.7479166666666667 | 3.525 |
| 0.748611111111111 | 3.525 |
| 0.7493055555555556 | 3.525 |
| 0.75 | 3.525 |
| 0.7506944444444444 | 3.525 |
| 0.751388888888889 | 0 |
| 0.7520833333333333 | 0 |
| 0.7527777777777778 | 0 |
| 0.7534722222222222 | 0 |
| 0.7541666666666668 | 0 |
| 0.7548611111111111 | 0 |
| 0.7555555555555555 | 0 |
| 0.75625 | 0 |
| 0.7569444444444445 | 0 |
| 0.7576388888888889 | 0 |
| 0.7583333333333333 | 0 |
| 0.7590277777777777 | 0 |
| 0.7597222222222223 | 0 |
| 0.7604166666666666 | 0 |
| 0.7611111111111111 | 0 |
| 0.7618055555555556 | 0 |
| 0.7625000000000001 | 0 |
| 0.7631944444444444 | 0 |
| 0.7638888888888888 | 0 |
| 0.7645833333333334 | 0 |
| 0.7652777777777778 | 0 |
| 0.7659722222222222 | 0 |
| 0.7666666666666666 | 0 |
| 0.7673611111111112 | 0 |
| 0.7680555555555556 | 0 |
| 0.7687499999999999 | 0 |
| 0.7694444444444444 | 0 |
| 0.7701388888888889 | 0 |
| 0.7708333333333334 | 0 |
| 0.7715277777777777 | 0 |
| 0.7722222222222223 | 0 |
| 0.7729166666666667 | 0 |
| 0.7736111111111111 | 0 |
| 0.7743055555555555 | 0 |
| 0.775 | 0 |
| 0.7756944444444445 | 0 |
| 0.7763888888888889 | 0 |
| 0.7770833333333332 | 0 |
| 0.7777777777777778 | 0 |
| 0.7784722222222222 | 0 |
| 0.7791666666666667 | 0 |
| 0.779861111111111 | 0 |
| 0.7805555555555556 | 0 |
| 0.78125 | 0 |
| 0.7819444444444444 | 0 |
| 0.782638888888889 | 0 |
| 0.7833333333333333 | 0 |
| 0.7840277777777778 | 0 |
| 0.7847222222222222 | 0 |
| 0.7854166666666668 | 0 |
| 0.7861111111111111 | 0 |
| 0.7868055555555555 | 0 |
| 0.7875 | 0 |
| 0.7881944444444445 | 0 |
| 0.7888888888888889 | 0 |
| 0.7895833333333333 | 0 |
| 0.7902777777777777 | 0 |
| 0.7909722222222223 | 0 |
| 0.7916666666666666 | 0 |
| 0.7923611111111111 | 0 |
| 0.7930555555555556 | 0 |
| 0.7937500000000001 | 0 |
| 0.7944444444444444 | 0 |
| 0.7951388888888888 | 0 |
| 0.7958333333333334 | 0 |
| 0.7965277777777778 | 0 |
| 0.7972222222222222 | 0 |
| 0.7979166666666666 | 0 |
| 0.7986111111111112 | 0 |
| 0.7993055555555556 | 0 |
| 0.7999999999999999 | 0 |
| 0.8006944444444444 | 0 |
| 0.8013888888888889 | 0 |
| 0.8020833333333334 | 0 |
| 0.8027777777777777 | 0 |
| 0.8034722222222223 | 0 |
| 0.8041666666666667 | 0 |
| 0.8048611111111111 | 0 |
| 0.8055555555555555 | 0 |
| 0.80625 | 0 |
| 0.8069444444444445 | 0 |
| 0.8076388888888889 | 0 |
| 0.8083333333333332 | 0 |
| 0.8090277777777778 | 0 |
| 0.8097222222222222 | 0 |
| 0.8104166666666667 | 0 |
| 0.811111111111111 | 0 |
| 0.8118055555555556 | 0 |
| 0.8125 | 0 |
| 0.8131944444444444 | 0 |
| 0.813888888888889 | 0 |
| 0.8145833333333333 | 0 |
| 0.8152777777777778 | 0 |
| 0.8159722222222222 | 0 |
| 0.8166666666666668 | 0 |
| 0.8173611111111111 | 0 |
| 0.8180555555555555 | 0 |
| 0.81875 | 0 |
| 0.8194444444444445 | 0 |
| 0.8201388888888889 | 0 |
| 0.8208333333333333 | 0 |
| 0.8215277777777777 | 0 |
| 0.8222222222222223 | 0 |
| 0.8229166666666666 | 0 |
| 0.8236111111111111 | 0 |
| 0.8243055555555556 | 0 |
| 0.8250000000000001 | 0 |
| 0.8256944444444444 | 0 |
| 0.8263888888888888 | 0 |
| 0.8270833333333334 | 0 |
| 0.8277777777777778 | 0 |
| 0.8284722222222222 | 0 |
| 0.8291666666666666 | 0 |
| 0.8298611111111112 | 0 |
| 0.8305555555555556 | 0 |
| 0.8312499999999999 | 0 |
| 0.8319444444444444 | 0 |
| 0.8326388888888889 | 0 |
| 0.8333333333333334 | 0 |
| 0.8340277777777777 | 0 |
| 0.8347222222222223 | 0 |
| 0.8354166666666667 | 0 |
| 0.8361111111111111 | 0 |
| 0.8368055555555555 | 0 |
| 0.8375 | 0 |
| 0.8381944444444445 | 0 |
| 0.8388888888888889 | 0 |
| 0.8395833333333332 | 0 |
| 0.8402777777777778 | 0 |
| 0.8409722222222222 | 0 |
| 0.8416666666666667 | 0 |
| 0.842361111111111 | 0 |
| 0.8430555555555556 | 0 |
| 0.84375 | 0 |
| 0.8444444444444444 | 0 |
| 0.845138888888889 | 0 |
| 0.8458333333333333 | 0 |
| 0.8465277777777778 | 0 |
| 0.8472222222222222 | 0 |
| 0.8479166666666668 | 0 |
| 0.8486111111111111 | 0 |
| 0.8493055555555555 | 0 |
| 0.85 | 0 |
| 0.8506944444444445 | 0 |
| 0.8513888888888889 | 0 |
| 0.8520833333333333 | 0 |
| 0.8527777777777777 | 0 |
| 0.8534722222222223 | 0 |
| 0.8541666666666666 | 0 |
| 0.8548611111111111 | 0 |
| 0.8555555555555556 | 0 |
| 0.8562500000000001 | 0 |
| 0.8569444444444444 | 0 |
| 0.8576388888888888 | 0 |
| 0.8583333333333334 | 0 |
| 0.8590277777777778 | 0 |
| 0.8597222222222222 | 0 |
| 0.8604166666666666 | 0 |
| 0.8611111111111112 | 0 |
| 0.8618055555555556 | 0 |
| 0.8624999999999999 | 0 |
| 0.8631944444444444 | 0 |
| 0.8638888888888889 | 0 |
| 0.8645833333333334 | 0 |
| 0.8652777777777777 | 0 |
| 0.8659722222222223 | 0 |
| 0.8666666666666667 | 0 |
| 0.8673611111111111 | 0 |
| 0.8680555555555555 | 0 |
| 0.86875 | 0 |
| 0.8694444444444445 | 0 |
| 0.8701388888888889 | 0 |
| 0.8708333333333332 | 0 |
| 0.8715277777777778 | 0 |
| 0.8722222222222222 | 0 |
| 0.8729166666666667 | 0 |
| 0.873611111111111 | 0 |
| 0.8743055555555556 | 0 |
| 0.875 | 0 |
| 0.8756944444444444 | 0 |
| 0.876388888888889 | 0 |
| 0.8770833333333333 | 0 |
| 0.8777777777777778 | 0 |
| 0.8784722222222222 | 0 |
| 0.8791666666666668 | 0 |
| 0.8798611111111111 | 0 |
| 0.8805555555555555 | 0 |
| 0.88125 | 0 |
| 0.8819444444444445 | 0 |
| 0.8826388888888889 | 0 |
| 0.8833333333333333 | 0 |
| 0.8840277777777777 | 0 |
| 0.8847222222222223 | 0 |
| 0.8854166666666666 | 0 |
| 0.8861111111111111 | 0 |
| 0.8868055555555556 | 0 |
| 0.8875000000000001 | 0 |
| 0.8881944444444444 | 0 |
| 0.8888888888888888 | 0 |
| 0.8895833333333334 | 0 |
| 0.8902777777777778 | 0 |
| 0.8909722222222222 | 0 |
| 0.8916666666666666 | 0 |
| 0.8923611111111112 | 0 |
| 0.8930555555555556 | 0 |
| 0.8937499999999999 | 0 |
| 0.8944444444444444 | 0 |
| 0.8951388888888889 | 0 |
| 0.8958333333333334 | 0 |
| 0.8965277777777777 | 0 |
| 0.8972222222222223 | 0 |
| 0.8979166666666667 | 0 |
| 0.8986111111111111 | 0 |
| 0.8993055555555555 | 0 |
| 0.9 | 0 |
| 0.9006944444444445 | 0 |
| 0.9013888888888889 | 0 |
| 0.9020833333333332 | 0 |
| 0.9027777777777778 | 0 |
| 0.9034722222222222 | 0 |
| 0.9041666666666667 | 0 |
| 0.904861111111111 | 0 |
| 0.9055555555555556 | 0 |
| 0.90625 | 0 |
| 0.9069444444444444 | 0 |
| 0.907638888888889 | 0 |
| 0.9083333333333333 | 0 |
| 0.9090277777777778 | 0 |
| 0.9097222222222222 | 0 |
| 0.9104166666666668 | 0 |
| 0.9111111111111111 | 0 |
| 0.9118055555555555 | 0 |
| 0.9125 | 0 |
| 0.9131944444444445 | 0 |
| 0.9138888888888889 | 0 |
| 0.9145833333333333 | 0 |
| 0.9152777777777777 | 0 |
| 0.9159722222222223 | 0 |
| 0.9166666666666666 | 0 |
| 0.9173611111111111 | 0 |
| 0.9180555555555556 | 0 |
| 0.9187500000000001 | 0 |
| 0.9194444444444444 | 0 |
| 0.9201388888888888 | 0 |
| 0.9208333333333334 | 0 |
| 0.9215277777777778 | 0 |
| 0.9222222222222222 | 0 |
| 0.9229166666666666 | 0 |
| 0.9236111111111112 | 0 |
| 0.9243055555555556 | 0 |
| 0.9249999999999999 | 0 |
| 0.9256944444444444 | 0 |
| 0.9263888888888889 | 0 |
| 0.9270833333333334 | 0 |
| 0.9277777777777777 | 0 |
| 0.9284722222222223 | 0 |
| 0.9291666666666667 | 0 |
| 0.9298611111111111 | 0 |
| 0.9305555555555555 | 0 |
| 0.93125 | 0 |
| 0.9319444444444445 | 0 |
| 0.9326388888888889 | 0 |
| 0.9333333333333332 | 0 |
| 0.9340277777777778 | 0 |
| 0.9347222222222222 | 0 |
| 0.9354166666666667 | 0 |
| 0.936111111111111 | 0 |
| 0.9368055555555556 | 0 |
| 0.9375 | 0 |
| 0.9381944444444444 | 0 |
| 0.938888888888889 | 0 |
| 0.9395833333333333 | 0 |
| 0.9402777777777778 | 0 |
| 0.9409722222222222 | 0 |
| 0.9416666666666668 | 0 |
| 0.9423611111111111 | 0 |
| 0.9430555555555555 | 0 |
| 0.94375 | 0 |
| 0.9444444444444445 | 0 |
| 0.9451388888888889 | 0 |
| 0.9458333333333333 | 0 |
| 0.9465277777777777 | 0 |
| 0.9472222222222223 | 0 |
| 0.9479166666666666 | 0 |
| 0.9486111111111111 | 0 |
| 0.9493055555555556 | 0 |
| 0.9500000000000001 | 0 |
| 0.9506944444444444 | 0 |
| 0.9513888888888888 | 0 |
| 0.9520833333333334 | 0 |
| 0.9527777777777778 | 0 |
| 0.9534722222222222 | 0 |
| 0.9541666666666666 | 0 |
| 0.9548611111111112 | 0 |
| 0.9555555555555556 | 0 |
| 0.9562499999999999 | 0 |
| 0.9569444444444444 | 0 |
| 0.9576388888888889 | 0 |
| 0.9583333333333334 | 0 |
| 0.9590277777777777 | 0 |
| 0.9597222222222223 | 0 |
| 0.9604166666666667 | 0 |
| 0.9611111111111111 | 0 |
| 0.9618055555555555 | 0 |
| 0.9625 | 0 |
| 0.9631944444444445 | 0 |
| 0.9638888888888889 | 0 |
| 0.9645833333333332 | 0 |
| 0.9652777777777778 | 0 |
| 0.9659722222222222 | 0 |
| 0.9666666666666667 | 0 |
| 0.967361111111111 | 0 |
| 0.9680555555555556 | 0 |
| 0.96875 | 0 |
| 0.9694444444444444 | 0 |
| 0.970138888888889 | 0 |
| 0.9708333333333333 | 0 |
| 0.9715277777777778 | 0 |
| 0.9722222222222222 | 0 |
| 0.9729166666666668 | 0 |
| 0.9736111111111111 | 0 |
| 0.9743055555555555 | 0 |
| 0.975 | 0 |
| 0.9756944444444445 | 0 |
| 0.9763888888888889 | 0 |
| 0.9770833333333333 | 0 |
| 0.9777777777777777 | 0 |
| 0.9784722222222223 | 0 |
| 0.9791666666666666 | 0 |
| 0.9798611111111111 | 0 |
| 0.9805555555555556 | 0 |
| 0.9812500000000001 | 0 |
| 0.9819444444444444 | 0 |
| 0.9826388888888888 | 0 |
| 0.9833333333333334 | 0 |
| 0.9840277777777778 | 0 |
| 0.9847222222222222 | 0 |
| 0.9854166666666666 | 0 |
| 0.9861111111111112 | 0 |
| 0.9868055555555556 | 0 |
| 0.9874999999999999 | 0 |
| 0.9881944444444444 | 0 |
| 0.9888888888888889 | 0 |
| 0.9895833333333334 | 0 |
| 0.9902777777777777 | 0 |
| 0.9909722222222223 | 0 |
| 0.9916666666666667 | 0 |
| 0.9923611111111111 | 0 |
| 0.9930555555555555 | 0 |
| 0.99375 | 0 |
| 0.9944444444444445 | 0 |
| 0.9951388888888889 | 0 |
| 0.9958333333333332 | 0 |
| 0.9965277777777778 | 0 |
| 0.9972222222222222 | 0 |
| 0.9979166666666667 | 0 |
| 0.998611111111111 | 0 |
| 0.9993055555555556 | 0 |